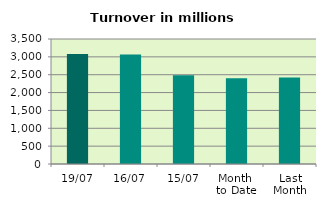
| Category | Series 0 |
|---|---|
| 19/07 | 3077.378 |
| 16/07 | 3064.547 |
| 15/07 | 2488.354 |
| Month 
to Date | 2399.265 |
| Last
Month | 2424.747 |